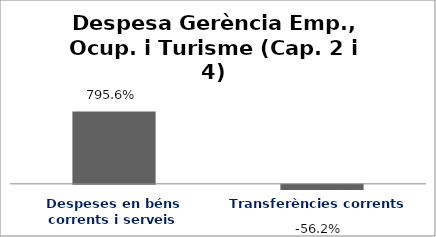
| Category | Series 0 |
|---|---|
| Despeses en béns corrents i serveis | 7.956 |
| Transferències corrents | -0.562 |